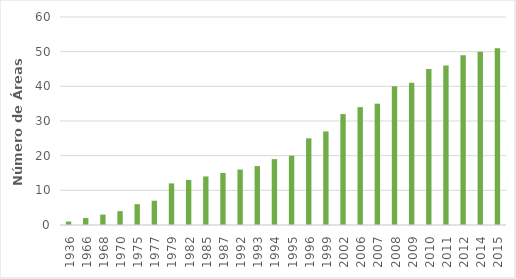
| Category | Número de Áreas Protegidas |
|---|---|
| 1936.0 | 1 |
| 1966.0 | 2 |
| 1968.0 | 3 |
| 1970.0 | 4 |
| 1975.0 | 6 |
| 1977.0 | 7 |
| 1979.0 | 12 |
| 1982.0 | 13 |
| 1985.0 | 14 |
| 1987.0 | 15 |
| 1992.0 | 16 |
| 1993.0 | 17 |
| 1994.0 | 19 |
| 1995.0 | 20 |
| 1996.0 | 25 |
| 1999.0 | 27 |
| 2002.0 | 32 |
| 2006.0 | 34 |
| 2007.0 | 35 |
| 2008.0 | 40 |
| 2009.0 | 41 |
| 2010.0 | 45 |
| 2011.0 | 46 |
| 2012.0 | 49 |
| 2014.0 | 50 |
| 2015.0 | 51 |